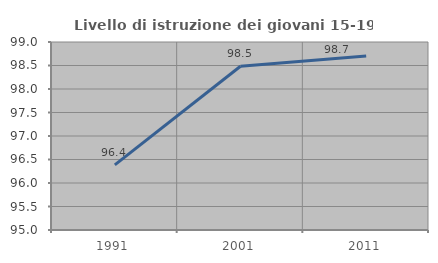
| Category | Livello di istruzione dei giovani 15-19 anni |
|---|---|
| 1991.0 | 96.386 |
| 2001.0 | 98.485 |
| 2011.0 | 98.701 |